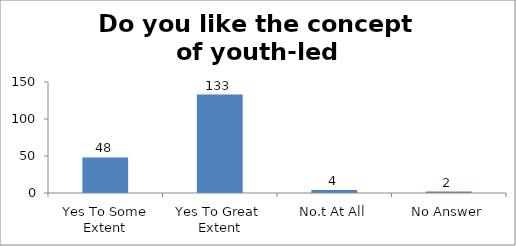
| Category | Do you like the concept of youth-led changemaking?  |
|---|---|
| Yes To Some Extent | 48 |
| Yes To Great  Extent | 133 |
| No.t At All | 4 |
| No Answer | 2 |